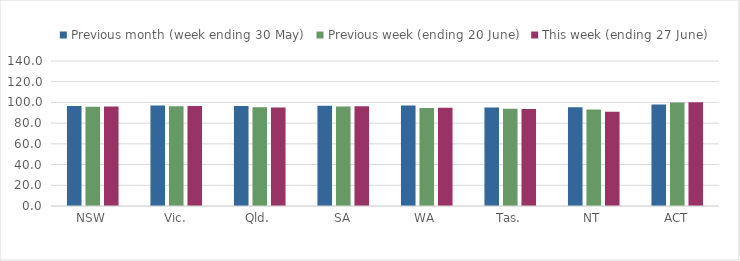
| Category | Previous month (week ending 30 May) | Previous week (ending 20 June) | This week (ending 27 June) |
|---|---|---|---|
| NSW | 96.641 | 95.775 | 96.146 |
| Vic. | 96.932 | 96.285 | 96.524 |
| Qld. | 96.588 | 95.446 | 95.138 |
| SA | 96.885 | 96.039 | 96.391 |
| WA | 97.03 | 94.566 | 94.761 |
| Tas. | 95.04 | 93.931 | 93.687 |
| NT | 95.385 | 93.131 | 91.035 |
| ACT | 98.091 | 99.951 | 100.053 |